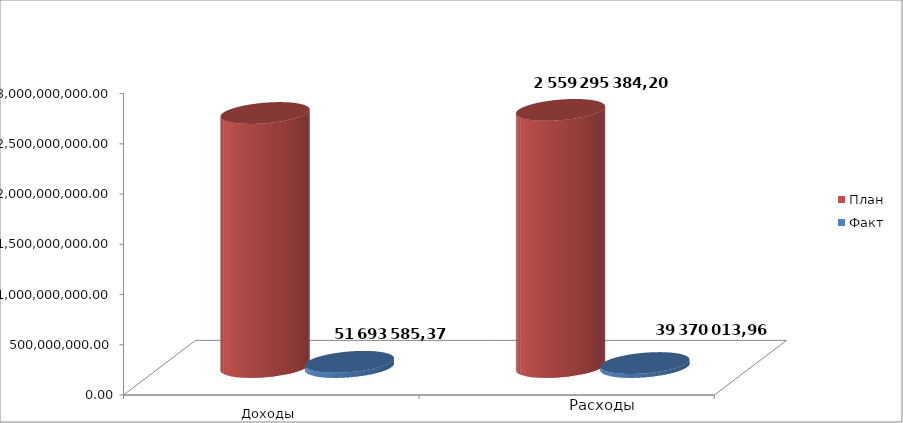
| Category | План | Факт |
|---|---|---|
| 0 | 2528214872 | 51693585.37 |
| 1 | 2559295384.2 | 39370013.96 |